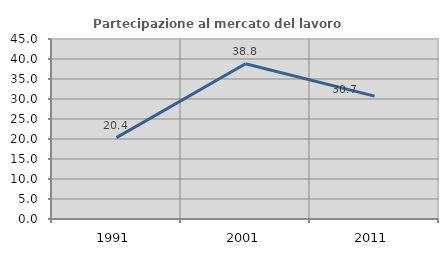
| Category | Partecipazione al mercato del lavoro  femminile |
|---|---|
| 1991.0 | 20.35 |
| 2001.0 | 38.81 |
| 2011.0 | 30.728 |